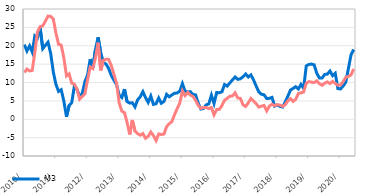
| Category | M3  | Домаћи кредити немонетарном сектору |
|---|---|---|
| 2010-01-01 | 20.321 | 12.716 |
| 2010-02-01 | 18.563 | 13.658 |
| 2010-03-01 | 19.958 | 13.148 |
| 2010-04-01 | 18.299 | 13.298 |
| 2010-05-01 | 22.704 | 18.254 |
| 2010-06-01 | 22.117 | 23.797 |
| 2010-07-01 | 24.945 | 25.198 |
| 2010-08-01 | 19.219 | 25.416 |
| 2010-09-01 | 20.121 | 26.706 |
| 2010-10-01 | 20.973 | 28.071 |
| 2010-11-01 | 17.912 | 28.011 |
| 2010-12-01 | 12.874 | 27.273 |
| 2011-01-01 | 9.481 | 23.431 |
| 2011-02-01 | 7.576 | 20.396 |
| 2011-03-01 | 8.038 | 20.178 |
| 2011-04-01 | 4.954 | 16.733 |
| 2011-05-01 | 0.664 | 11.803 |
| 2011-06-01 | 3.749 | 12.354 |
| 2011-07-01 | 4.529 | 9.802 |
| 2011-08-01 | 9.076 | 9.549 |
| 2011-09-01 | 8.13 | 8.192 |
| 2011-10-01 | 6.156 | 5.467 |
| 2011-11-01 | 7.029 | 6.196 |
| 2011-12-01 | 10.264 | 6.941 |
| 2012-01-01 | 12.01 | 10.729 |
| 2012-02-01 | 16.354 | 14.221 |
| 2012-03-01 | 13.992 | 13.782 |
| 2012-04-01 | 18.952 | 16.69 |
| 2012-05-01 | 22.329 | 20.823 |
| 2012-06-01 | 18.134 | 13.296 |
| 2012-07-01 | 15.507 | 16.043 |
| 2012-08-01 | 15.015 | 16.313 |
| 2012-09-01 | 13.837 | 16.292 |
| 2012-10-01 | 11.912 | 14.641 |
| 2012-11-01 | 10.629 | 12.241 |
| 2012-12-01 | 9.421 | 9.834 |
| 2013-01-01 | 6.554 | 4.448 |
| 2013-02-01 | 5.916 | 2.211 |
| 2013-03-01 | 8.196 | 1.791 |
| 2013-04-01 | 4.809 | -0.816 |
| 2013-05-01 | 4.39 | -4.149 |
| 2013-06-01 | 4.482 | -0.203 |
| 2013-07-01 | 3.358 | -3.232 |
| 2013-08-01 | 5.277 | -3.913 |
| 2013-09-01 | 6.108 | -4.338 |
| 2013-10-01 | 7.502 | -3.897 |
| 2013-11-01 | 5.896 | -5.181 |
| 2013-12-01 | 4.573 | -4.65 |
| 2014-01-01 | 6.313 | -3.453 |
| 2014-02-01 | 4.038 | -4.43 |
| 2014-03-01 | 4.234 | -5.804 |
| 2014-04-01 | 5.797 | -3.993 |
| 2014-05-01 | 4.358 | -4.149 |
| 2014-06-01 | 4.845 | -4.035 |
| 2014-07-01 | 6.767 | -2.016 |
| 2014-08-01 | 6.108 | -1.198 |
| 2014-09-01 | 6.605 | -0.64 |
| 2014-10-01 | 7.075 | 1.254 |
| 2014-11-01 | 7.143 | 2.874 |
| 2014-12-01 | 7.648 | 4.423 |
| 2015-01-01 | 9.694 | 7.684 |
| 2015-02-01 | 7.639 | 6.418 |
| 2015-03-01 | 7.404 | 7.278 |
| 2015-04-01 | 7.508 | 6.557 |
| 2015-05-01 | 6.749 | 6.196 |
| 2015-06-01 | 6.629 | 5.14 |
| 2015-07-01 | 4.381 | 3.777 |
| 2015-08-01 | 2.769 | 2.955 |
| 2015-09-01 | 2.936 | 3.226 |
| 2015-10-01 | 3.902 | 3.199 |
| 2015-11-01 | 4.175 | 2.893 |
| 2015-12-01 | 6.564 | 3.196 |
| 2016-01-01 | 4.278 | 1.199 |
| 2016-02-01 | 7.267 | 2.638 |
| 2016-03-01 | 7.218 | 2.687 |
| 2016-04-01 | 7.458 | 3.711 |
| 2016-05-01 | 9.45 | 5.171 |
| 2016-06-01 | 9.03 | 5.69 |
| 2016-07-01 | 9.881 | 6.257 |
| 2016-08-01 | 10.715 | 6.355 |
| 2016-09-01 | 11.496 | 7.196 |
| 2016-10-01 | 10.853 | 5.785 |
| 2016-11-01 | 11.002 | 5.691 |
| 2016-12-01 | 11.553 | 3.906 |
| 2017-01-01 | 12.319 | 3.474 |
| 2017-02-01 | 11.489 | 4.47 |
| 2017-03-01 | 12.067 | 5.654 |
| 2017-04-01 | 10.696 | 4.923 |
| 2017-05-01 | 9.013 | 4.221 |
| 2017-06-01 | 7.423 | 3.312 |
| 2017-07-01 | 6.807 | 3.565 |
| 2017-08-01 | 6.642 | 3.755 |
| 2017-09-01 | 5.632 | 2.278 |
| 2017-10-01 | 5.691 | 3.574 |
| 2017-11-01 | 5.952 | 4.092 |
| 2017-12-01 | 3.567 | 3.671 |
| 2018-01-01 | 3.888 | 3.977 |
| 2018-02-01 | 3.511 | 3.859 |
| 2018-03-01 | 3.318 | 3.502 |
| 2018-04-01 | 4.689 | 3.953 |
| 2018-05-01 | 6.249 | 5.016 |
| 2018-06-01 | 7.929 | 5.586 |
| 2018-07-01 | 8.383 | 4.847 |
| 2018-08-01 | 8.861 | 5.412 |
| 2018-09-01 | 8.24 | 7.016 |
| 2018-10-31 | 9.483 | 7.163 |
| 2018-11-30 | 8.409 | 7.417 |
| 2018-12-31 | 14.522 | 9.795 |
| 2019-01-31 | 14.909 | 10.252 |
| 2019-02-28 | 15.018 | 10.086 |
| 2019-03-31 | 14.797 | 9.982 |
| 2019-04-30 | 12.506 | 10.444 |
| 2019-05-31 | 11.216 | 9.694 |
| 2019-06-30 | 11.23 | 9.224 |
| 2019-07-31 | 12.186 | 9.826 |
| 2019-08-31 | 12.279 | 10.177 |
| 2019-09-30 | 13.127 | 9.697 |
| 2019-10-31 | 11.864 | 10.311 |
| 2019-11-30 | 12.513 | 9.755 |
| 2019-12-31 | 8.354 | 9.245 |
| 2020-01-31 | 8.237 | 9.334 |
| 2020-02-29 | 9.035 | 10.229 |
| 2020-03-31 | 10.113 | 11.424 |
| 2020-04-30 | 13.811 | 11.641 |
| 2020-05-31 | 17.557 | 12.071 |
| 2020-06-30 | 18.995 | 13.679 |